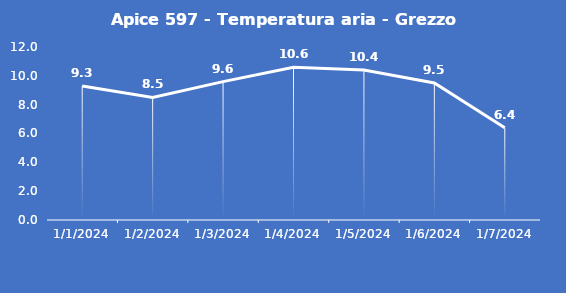
| Category | Apice 597 - Temperatura aria - Grezzo (°C) |
|---|---|
| 1/1/24 | 9.3 |
| 1/2/24 | 8.5 |
| 1/3/24 | 9.6 |
| 1/4/24 | 10.6 |
| 1/5/24 | 10.4 |
| 1/6/24 | 9.5 |
| 1/7/24 | 6.4 |